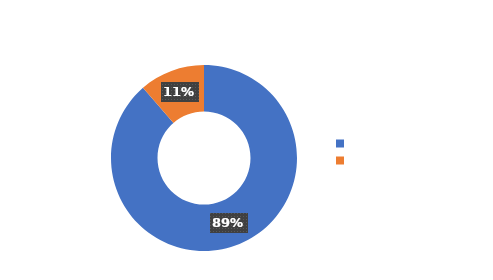
| Category | Total |
|---|---|
| Queja | 140 |
| Sugerencia | 18 |